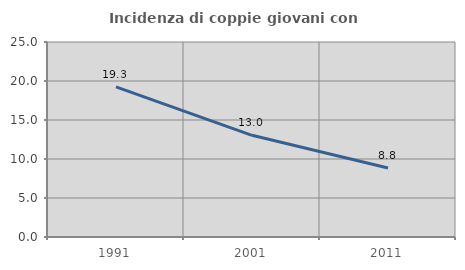
| Category | Incidenza di coppie giovani con figli |
|---|---|
| 1991.0 | 19.254 |
| 2001.0 | 13.037 |
| 2011.0 | 8.838 |